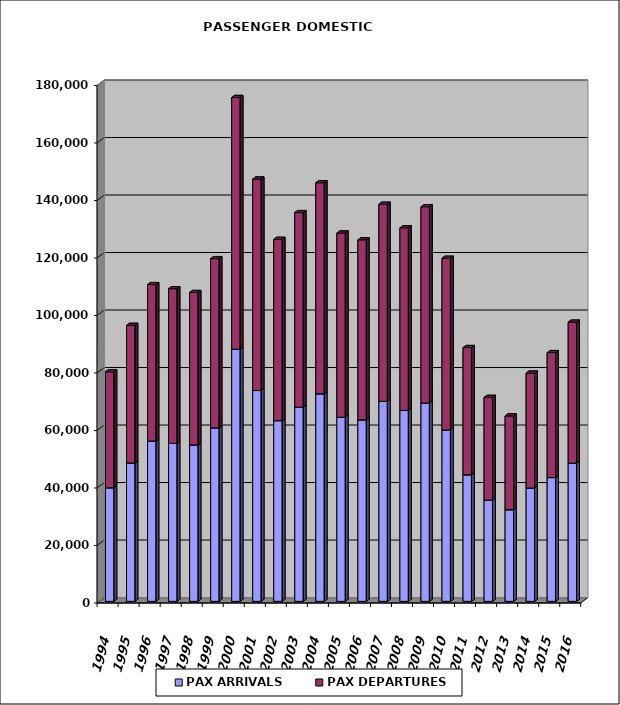
| Category | PAX ARRIVALS | PAX DEPARTURES |
|---|---|---|
| 1994.0 | 39502 | 40342 |
| 1995.0 | 48134 | 47860 |
| 1996.0 | 55761 | 54404 |
| 1997.0 | 54936 | 53809 |
| 1998.0 | 54420 | 52990 |
| 1999.0 | 60310 | 58886 |
| 2000.0 | 87720 | 87520 |
| 2001.0 | 73327 | 73561 |
| 2002.0 | 62851 | 63043 |
| 2003.0 | 67544 | 67662 |
| 2004.0 | 72185 | 73417 |
| 2005.0 | 64049 | 64051 |
| 2006.0 | 63112 | 62619 |
| 2007.0 | 69569 | 68535 |
| 2008.0 | 66425 | 63514 |
| 2009.0 | 68977 | 68276 |
| 2010.0 | 59579 | 59750 |
| 2011.0 | 44016 | 44255 |
| 2012.0 | 35208 | 35729 |
| 2013.0 | 31866 | 32613 |
| 2014.0 | 39424 | 39965 |
| 2015.0 | 43048 | 43467 |
| 2016.0 | 48083 | 49022 |